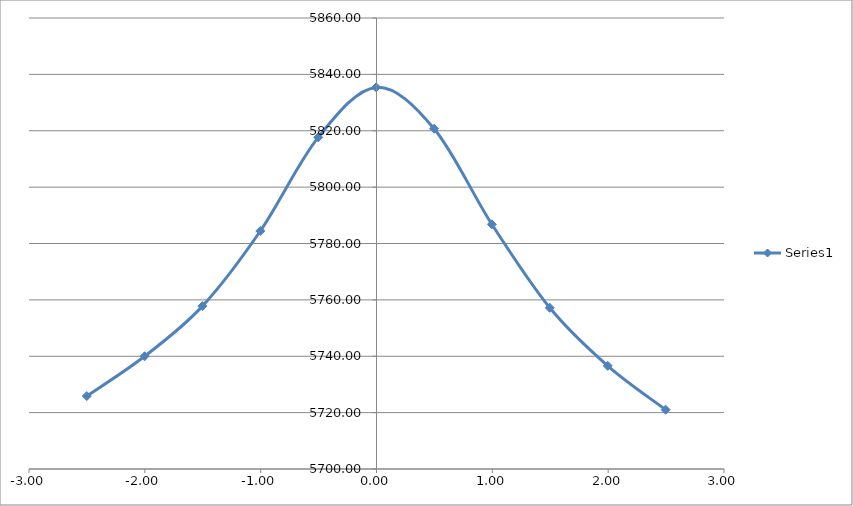
| Category | Series 0 |
|---|---|
| -2.5010000000000003 | 5725.876 |
| -2.002 | 5739.995 |
| -1.5030000000000001 | 5757.785 |
| -1.0030000000000001 | 5784.432 |
| -0.5030000000000001 | 5817.652 |
| -0.0030000000000001137 | 5835.383 |
| 0.4969999999999999 | 5820.728 |
| 0.9959999999999996 | 5786.807 |
| 1.4959999999999996 | 5757.185 |
| 1.9959999999999996 | 5736.603 |
| 2.4959999999999996 | 5721.037 |